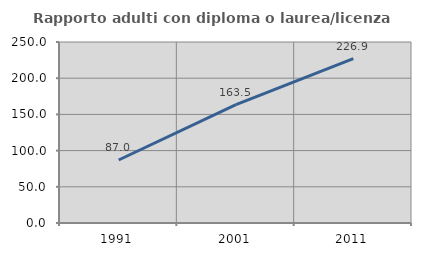
| Category | Rapporto adulti con diploma o laurea/licenza media  |
|---|---|
| 1991.0 | 87 |
| 2001.0 | 163.498 |
| 2011.0 | 226.906 |